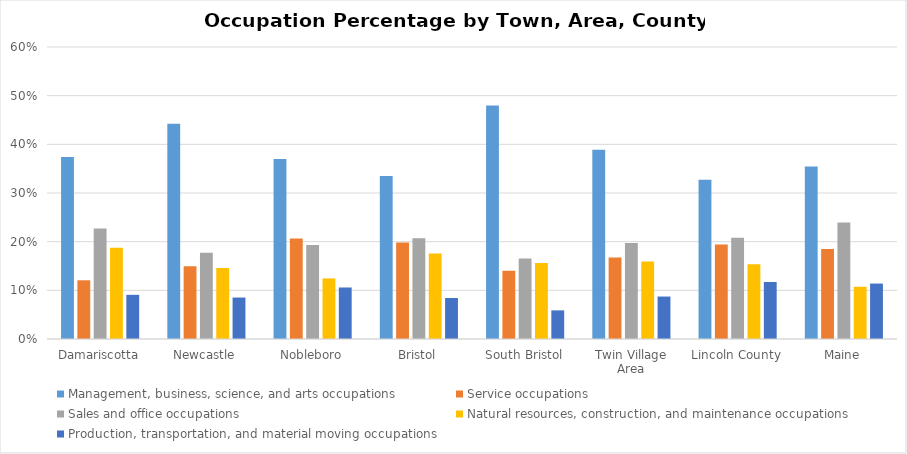
| Category | Management, business, science, and arts occupations | Service occupations | Sales and office occupations | Natural resources, construction, and maintenance occupations | Production, transportation, and material moving occupations |
|---|---|---|---|---|---|
| Damariscotta | 0.374 | 0.121 | 0.227 | 0.188 | 0.091 |
| Newcastle | 0.442 | 0.149 | 0.177 | 0.146 | 0.085 |
| Nobleboro | 0.37 | 0.207 | 0.193 | 0.125 | 0.106 |
| Bristol | 0.335 | 0.198 | 0.207 | 0.175 | 0.084 |
| South Bristol | 0.48 | 0.14 | 0.165 | 0.156 | 0.059 |
| Twin Village Area | 0.389 | 0.167 | 0.197 | 0.159 | 0.087 |
| Lincoln County | 0.327 | 0.194 | 0.208 | 0.153 | 0.117 |
| Maine | 0.354 | 0.185 | 0.239 | 0.107 | 0.114 |